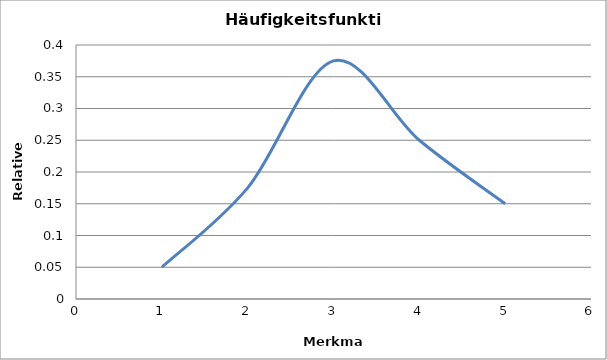
| Category | Relative Häufigkeit |
|---|---|
| 1.0 | 0.05 |
| 2.0 | 0.175 |
| 3.0 | 0.375 |
| 4.0 | 0.25 |
| 5.0 | 0.15 |